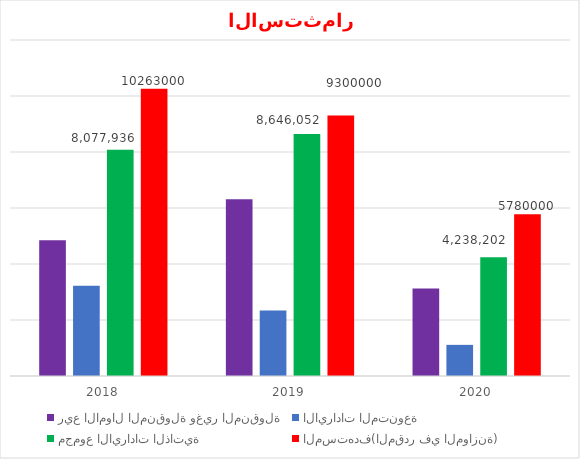
| Category | ريع الاموال المنقولة وغير المنقولة | الايرادات المتنوعة | مجموع الايرادات الذاتية | المستهدف(المقدر في الموازنة) |
|---|---|---|---|---|
| 2018.0 | 4850401 | 3227535 | 8077936 | 10263000 |
| 2019.0 | 6309844 | 2336208 | 8646052 | 9300000 |
| 2020.0 | 3126182 | 1112020 | 4238202 | 5780000 |